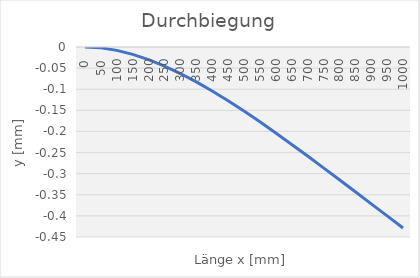
| Category | Series 0 |
|---|---|
| 0.0 | 0 |
| 50.0 | -0.002 |
| 100.0 | -0.008 |
| 150.0 | -0.017 |
| 200.0 | -0.03 |
| 250.0 | -0.045 |
| 300.0 | -0.063 |
| 350.0 | -0.083 |
| 400.0 | -0.104 |
| 450.0 | -0.127 |
| 500.0 | -0.152 |
| 550.0 | -0.177 |
| 600.0 | -0.204 |
| 650.0 | -0.231 |
| 700.0 | -0.258 |
| 750.0 | -0.286 |
| 800.0 | -0.315 |
| 850.0 | -0.343 |
| 900.0 | -0.371 |
| 950.0 | -0.4 |
| 1000.0 | -0.429 |